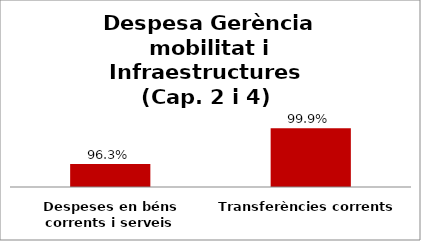
| Category | Series 0 |
|---|---|
| Despeses en béns corrents i serveis | 0.963 |
| Transferències corrents | 0.999 |